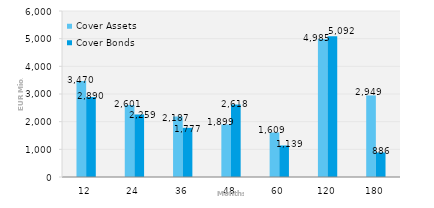
| Category | Cover Assets | Cover Bonds |
|---|---|---|
| 12.0 | 3470.121 | 2890 |
| 24.0 | 2600.901 | 2259.185 |
| 36.0 | 2186.51 | 1777 |
| 48.0 | 1899.457 | 2618 |
| 60.0 | 1609.269 | 1139 |
| 120.0 | 4985.439 | 5091.5 |
| 180.0 | 2948.529 | 886 |